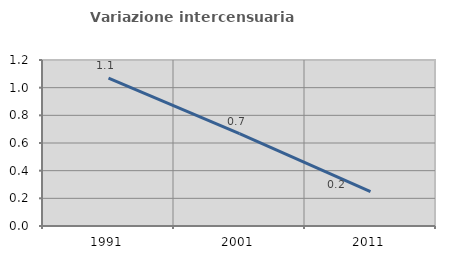
| Category | Variazione intercensuaria annua |
|---|---|
| 1991.0 | 1.069 |
| 2001.0 | 0.668 |
| 2011.0 | 0.248 |